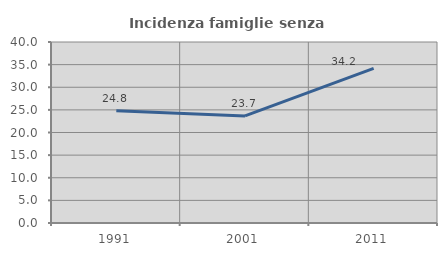
| Category | Incidenza famiglie senza nuclei |
|---|---|
| 1991.0 | 24.785 |
| 2001.0 | 23.659 |
| 2011.0 | 34.165 |